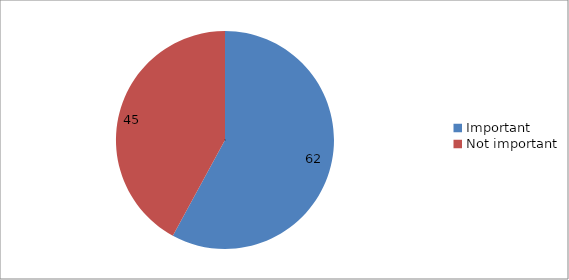
| Category | Series 0 |
|---|---|
| Important | 62 |
| Not important | 45 |